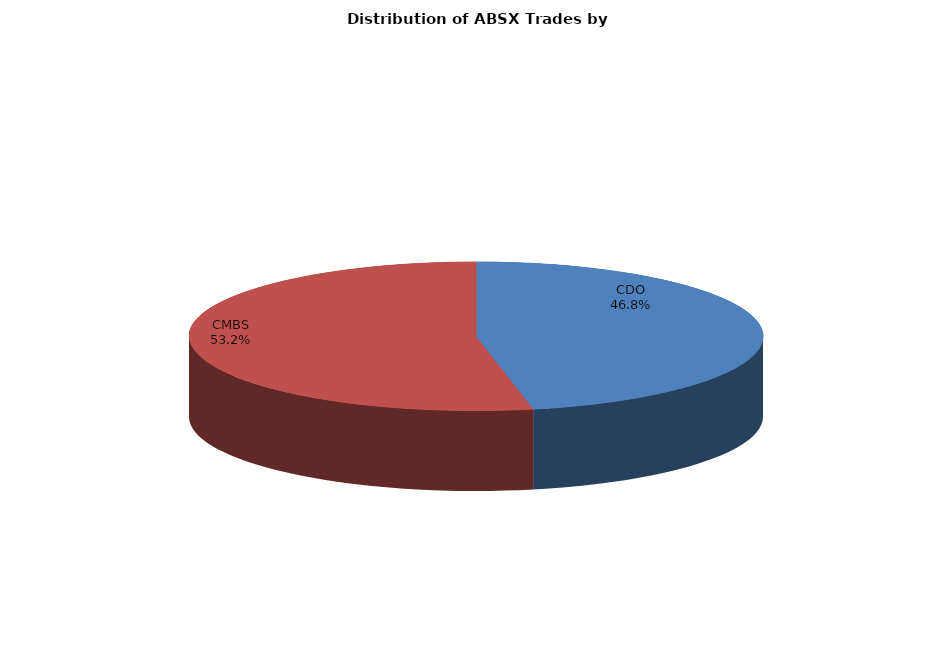
| Category | Series 0 |
|---|---|
| CDO | 198 |
| CMBS | 225 |